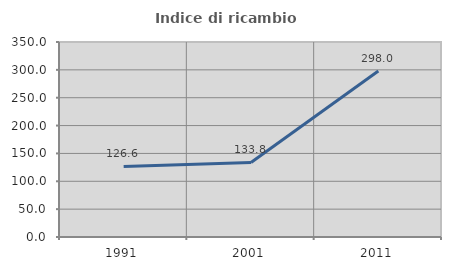
| Category | Indice di ricambio occupazionale  |
|---|---|
| 1991.0 | 126.582 |
| 2001.0 | 133.803 |
| 2011.0 | 298.039 |